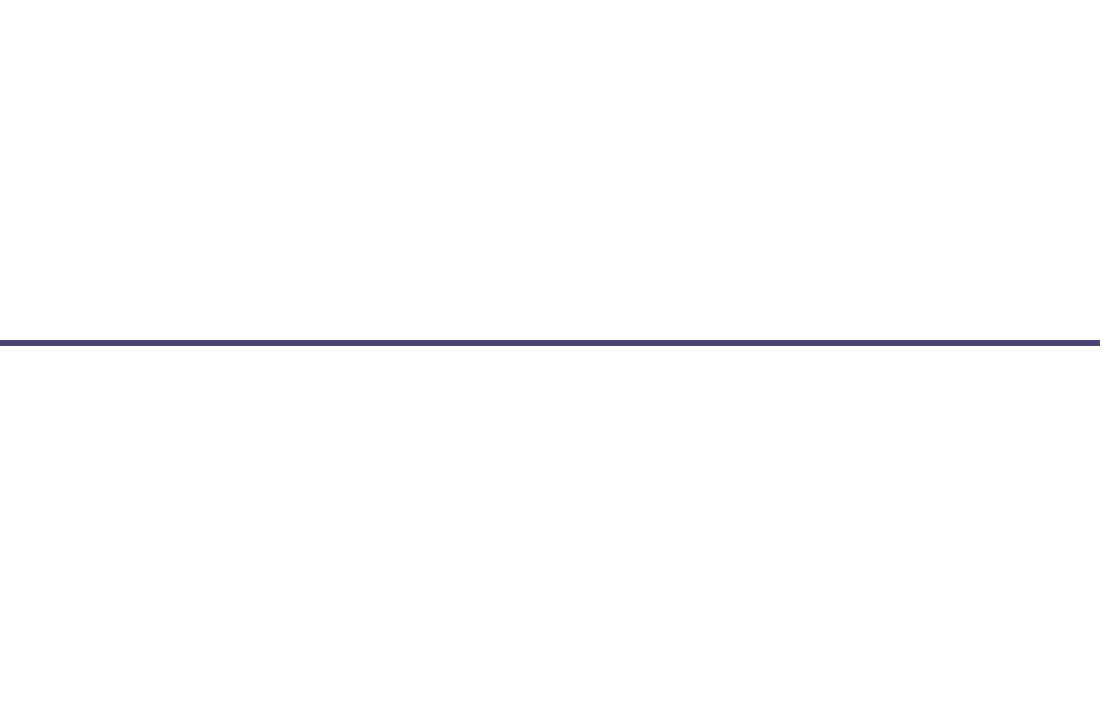
| Category | Pozicija |
|---|---|
| 0 | 1 |
| 1 | -2 |
| 2 | 1 |
| 3 | -1 |
| 4 | -0.5 |
| 5 | 2 |
| 6 | 0.5 |
| 7 | -1 |
| 8 | 0.5 |
| 9 | -2 |